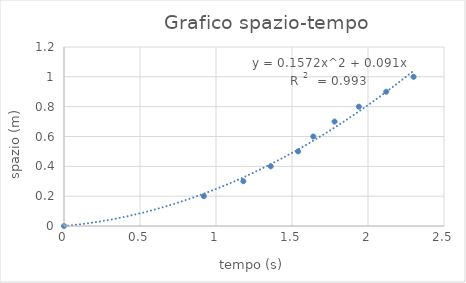
| Category | Series 0 |
|---|---|
| 0.0 | 0 |
| 0.9199999999999999 | 0.2 |
| 1.1800000000000002 | 0.3 |
| 1.3599999999999999 | 0.4 |
| 1.54 | 0.5 |
| 1.64 | 0.6 |
| 1.78 | 0.7 |
| 1.94 | 0.8 |
| 2.12 | 0.9 |
| 2.3 | 1 |